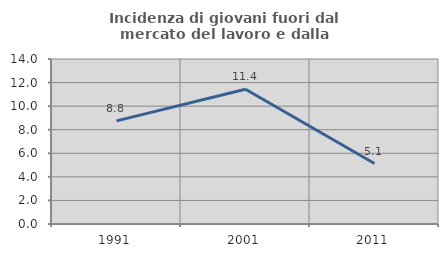
| Category | Incidenza di giovani fuori dal mercato del lavoro e dalla formazione  |
|---|---|
| 1991.0 | 8.75 |
| 2001.0 | 11.429 |
| 2011.0 | 5.128 |